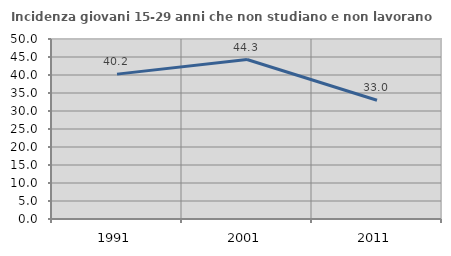
| Category | Incidenza giovani 15-29 anni che non studiano e non lavorano  |
|---|---|
| 1991.0 | 40.244 |
| 2001.0 | 44.296 |
| 2011.0 | 32.974 |